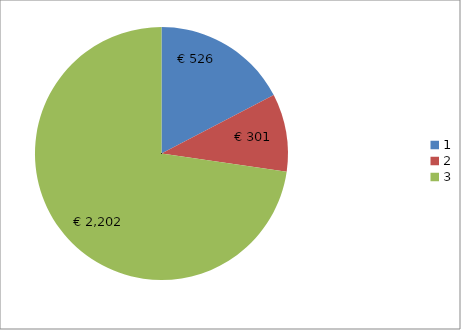
| Category | Series 0 |
|---|---|
| 0 | 526 |
| 1 | 301 |
| 2 | 2202 |